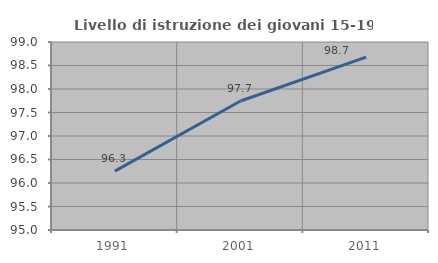
| Category | Livello di istruzione dei giovani 15-19 anni |
|---|---|
| 1991.0 | 96.254 |
| 2001.0 | 97.744 |
| 2011.0 | 98.678 |